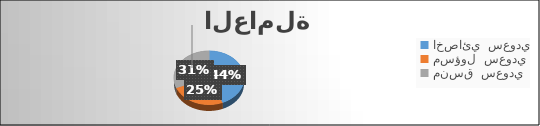
| Category | Series 0 |
|---|---|
| 0 | 7 |
| 1 | 4 |
| 2 | 5 |